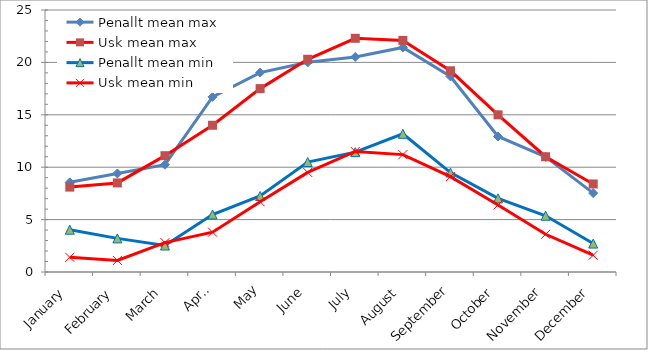
| Category | Penallt mean max | Usk mean max | Penallt mean min | Usk mean min |
|---|---|---|---|---|
| January | 8.555 | 8.1 | 4.035 | 1.4 |
| February | 9.403 | 8.5 | 3.207 | 1.1 |
| March | 10.239 | 11.1 | 2.526 | 2.8 |
| April | 16.71 | 14 | 5.487 | 3.8 |
| May | 19.029 | 17.5 | 7.255 | 6.7 |
| June | 20.007 | 20.3 | 10.493 | 9.5 |
| July | 20.519 | 22.3 | 11.435 | 11.5 |
| August | 21.426 | 22.1 | 13.187 | 11.2 |
| September | 18.66 | 19.2 | 9.49 | 9.1 |
| October | 12.932 | 15 | 7.026 | 6.4 |
| November | 10.983 | 11 | 5.367 | 3.6 |
| December | 7.529 | 8.4 | 2.713 | 1.6 |